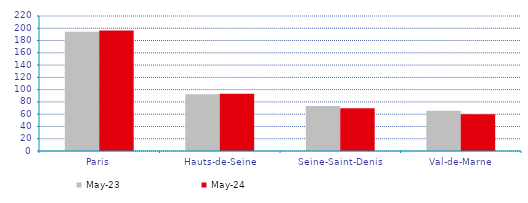
| Category | mai-23 | mai-24 |
|---|---|---|
| Paris | 194.15 | 196.206 |
| Hauts-de-Seine | 92.542 | 93.157 |
| Seine-Saint-Denis | 73.376 | 69.74 |
| Val-de-Marne | 65.501 | 60.038 |